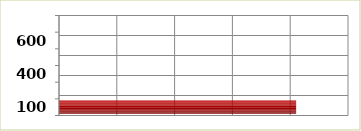
| Category | Series 0 |
|---|---|
| 100.0 | 2051347.45 |
| 200.0 | 0 |
| 400.0 | 0 |
| 500.0 | 0 |
| 600.0 | 0 |
| 700.0 | 0 |